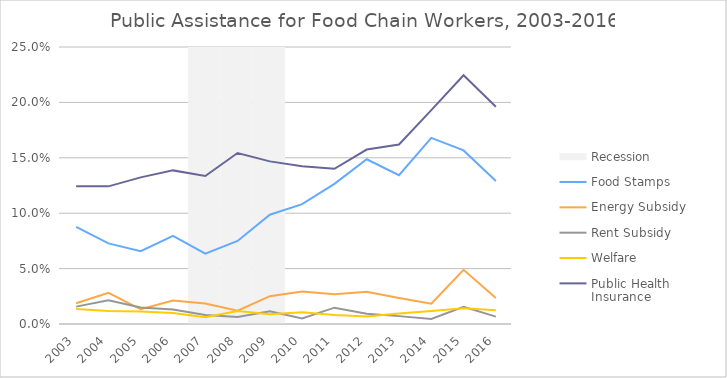
| Category | Recession |
|---|---|
| 2003.0 | 0 |
| 2004.0 | 0 |
| 2005.0 | 0 |
| 2006.0 | 0 |
| 2007.0 | 1 |
| 2008.0 | 1 |
| 2009.0 | 1 |
| 2010.0 | 0 |
| 2011.0 | 0 |
| 2012.0 | 0 |
| 2013.0 | 0 |
| 2014.0 | 0 |
| 2015.0 | 0 |
| 2016.0 | 0 |